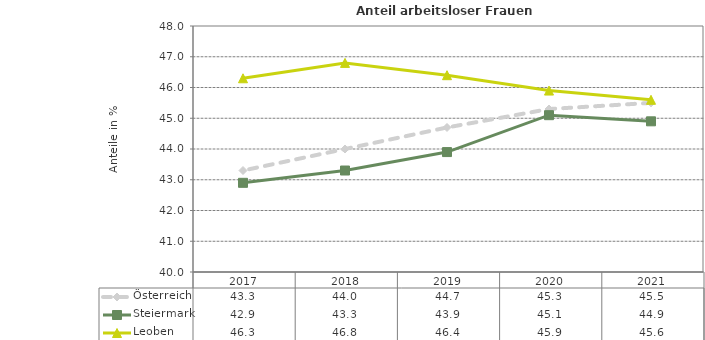
| Category | Österreich | Steiermark | Leoben |
|---|---|---|---|
| 2021.0 | 45.5 | 44.9 | 45.6 |
| 2020.0 | 45.3 | 45.1 | 45.9 |
| 2019.0 | 44.7 | 43.9 | 46.4 |
| 2018.0 | 44 | 43.3 | 46.8 |
| 2017.0 | 43.3 | 42.9 | 46.3 |